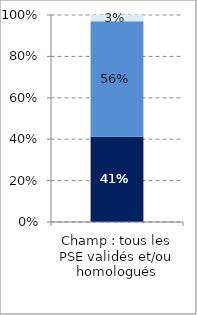
| Category | Homologation | Validation | Accord mixte (validation-homologation) |
|---|---|---|---|
| Champ : tous les PSE validés et/ou homologués | 0.412 | 0.558 | 0.03 |